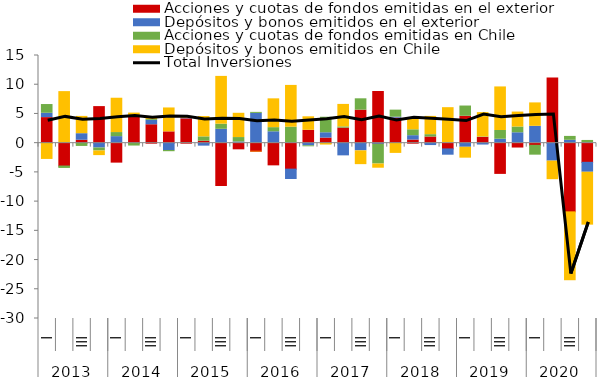
| Category | Acciones y cuotas de fondos emitidas en el exterior | Depósitos y bonos emitidos en el exterior | Acciones y cuotas de fondos emitidas en Chile | Depósitos y bonos emitidos en Chile |
|---|---|---|---|---|
| 0 | 4.374 | 0.742 | 1.496 | -2.783 |
| 1 | -3.909 | -0.009 | -0.406 | 8.82 |
| 2 | 0.499 | 1.122 | -0.558 | 2.959 |
| 3 | 6.256 | -0.827 | -0.512 | -0.791 |
| 4 | -3.243 | 1.118 | 0.697 | 5.873 |
| 5 | 4.458 | 0.039 | -0.491 | 0.649 |
| 6 | 3.151 | 0.752 | 0.145 | 0.308 |
| 7 | 1.934 | -1.256 | -0.205 | 4.09 |
| 8 | 4.163 | 0.101 | -0.052 | 0.306 |
| 9 | 0.336 | -0.507 | 0.741 | 3.477 |
| 10 | -7.243 | 2.378 | 0.873 | 8.174 |
| 11 | -0.969 | 0.205 | 0.757 | 4.15 |
| 12 | -1.389 | 5.094 | 0.173 | -0.107 |
| 13 | -3.711 | 1.947 | 0.708 | 4.929 |
| 14 | -4.444 | -1.774 | 2.735 | 7.147 |
| 15 | 2.204 | -0.456 | -0.162 | 2.305 |
| 16 | 0.873 | 0.91 | 2.653 | -0.324 |
| 17 | 2.579 | -2.171 | 0.206 | 3.848 |
| 18 | 5.648 | -1.318 | 1.942 | -2.357 |
| 19 | 8.839 | -0.193 | -3.374 | -0.718 |
| 20 | 4.276 | 0.168 | 1.208 | -1.75 |
| 21 | 0.532 | 0.749 | 1.005 | 2.044 |
| 22 | 1.056 | -0.41 | 0.401 | 3.124 |
| 23 | -0.983 | -1.075 | 0.025 | 6.047 |
| 24 | 4.602 | -0.701 | 1.752 | -1.865 |
| 25 | 0.995 | -0.32 | 0.07 | 4.164 |
| 26 | -5.171 | 0.676 | 1.494 | 7.452 |
| 27 | -0.662 | 1.779 | 0.986 | 2.557 |
| 28 | -0.366 | 2.884 | -1.686 | 4.005 |
| 29 | 11.132 | -3.072 | 0.003 | -3.175 |
| 30 | -11.753 | 0.492 | 0.663 | -11.784 |
| 31 | -3.275 | -1.702 | 0.464 | -9.047 |